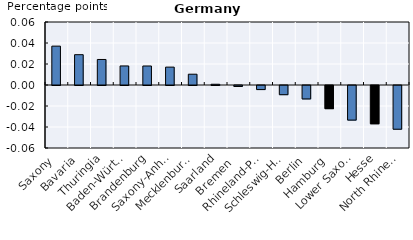
| Category | Series 0 | Series 1 | Series 2 | Series 3 |
|---|---|---|---|---|
| Saxony | 0 | 0.037 | 0 | 0 |
| Bavaria | 0 | 0.029 | 0 | 0 |
| Thuringia | 0 | 0.024 | 0 | 0 |
| Baden-Württemberg  | 0 | 0.018 | 0 | 0 |
| Brandenburg | 0 | 0.018 | 0 | 0 |
| Saxony-Anhalt | 0 | 0.017 | 0 | 0 |
| Mecklenburg-Vorpommern | 0 | 0.01 | 0 | 0 |
| Saarland | 0 | 0.001 | 0 | 0 |
| Bremen  | 0 | -0.001 | 0 | 0 |
| Rhineland-Palatinate | 0 | -0.004 | 0 | 0 |
| Schleswig-Holstein | 0 | 0 | -0.009 | 0 |
| Berlin | 0 | 0 | -0.013 | 0 |
| Hamburg | -0.022 | 0 | 0 | 0 |
| Lower Saxony  | 0 | 0 | -0.033 | 0 |
| Hesse | -0.036 | 0 | 0 | 0 |
| North Rhine-Westphalia | 0 | 0 | -0.042 | 0 |